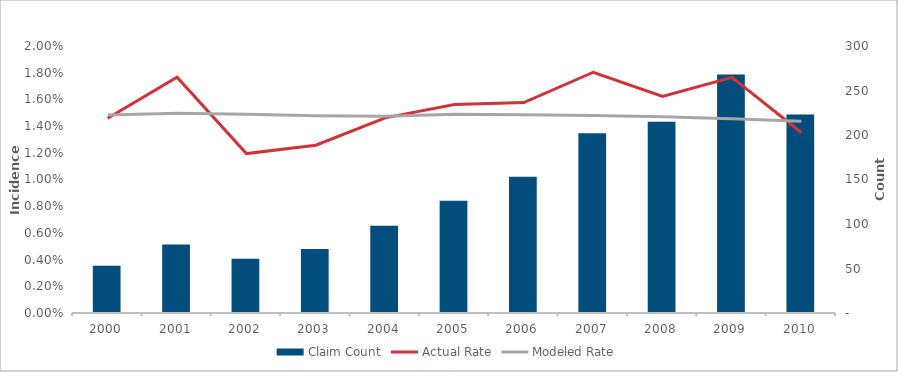
| Category | Claim Count |
|---|---|
| 2000.0 | 53 |
| 2001.0 | 77 |
| 2002.0 | 61 |
| 2003.0 | 72 |
| 2004.0 | 98 |
| 2005.0 | 126 |
| 2006.0 | 153 |
| 2007.0 | 202 |
| 2008.0 | 215 |
| 2009.0 | 268 |
| 2010.0 | 223 |